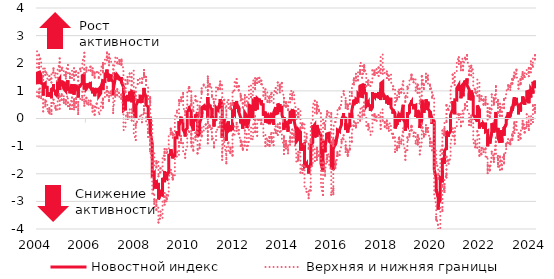
| Category | Новостной индекс | Верхняя и нижняя границы | Series 2 |
|---|---|---|---|
| 2004-02-02 | 1.694 | 0.954 | 2.433 |
| 2004-02-09 | 1.54 | 0.899 | 2.182 |
| 2004-02-16 | 1.43 | 0.903 | 1.956 |
| 2004-02-23 | 1.289 | 0.736 | 1.841 |
| 2004-03-01 | 1.298 | 0.813 | 1.782 |
| 2004-03-08 | 1.475 | 0.949 | 2.001 |
| 2004-03-15 | 1.307 | 0.767 | 1.847 |
| 2004-03-22 | 1.462 | 0.98 | 1.943 |
| 2004-03-29 | 1.723 | 1.14 | 2.305 |
| 2004-04-05 | 1.538 | 1.018 | 2.058 |
| 2004-04-12 | 1.479 | 0.944 | 2.013 |
| 2004-04-19 | 1.279 | 0.736 | 1.821 |
| 2004-04-26 | 1.297 | 0.775 | 1.82 |
| 2004-05-03 | 1.25 | 0.681 | 1.819 |
| 2004-05-10 | 1.098 | 0.445 | 1.751 |
| 2004-05-17 | 0.828 | 0.259 | 1.398 |
| 2004-05-24 | 0.883 | 0.303 | 1.462 |
| 2004-05-31 | 1.224 | 0.691 | 1.757 |
| 2004-06-07 | 1.279 | 0.73 | 1.828 |
| 2004-06-14 | 1.089 | 0.601 | 1.577 |
| 2004-06-21 | 1.069 | 0.443 | 1.696 |
| 2004-06-28 | 1.141 | 0.674 | 1.609 |
| 2004-07-05 | 1.131 | 0.575 | 1.686 |
| 2004-07-12 | 1.002 | 0.477 | 1.526 |
| 2004-07-19 | 0.882 | 0.32 | 1.445 |
| 2004-07-26 | 0.837 | 0.238 | 1.437 |
| 2004-08-02 | 0.838 | 0.313 | 1.363 |
| 2004-08-09 | 0.954 | 0.373 | 1.535 |
| 2004-08-16 | 0.803 | 0.216 | 1.391 |
| 2004-08-23 | 0.897 | 0.318 | 1.476 |
| 2004-08-30 | 0.832 | 0.177 | 1.488 |
| 2004-09-06 | 0.831 | 0.28 | 1.382 |
| 2004-09-13 | 0.732 | 0.16 | 1.304 |
| 2004-09-20 | 1.061 | 0.562 | 1.559 |
| 2004-09-27 | 1.093 | 0.502 | 1.684 |
| 2004-10-04 | 1.117 | 0.594 | 1.64 |
| 2004-10-11 | 1.248 | 0.682 | 1.814 |
| 2004-10-18 | 1.116 | 0.586 | 1.647 |
| 2004-10-25 | 1.056 | 0.551 | 1.561 |
| 2004-11-01 | 0.955 | 0.364 | 1.547 |
| 2004-11-08 | 1.014 | 0.395 | 1.632 |
| 2004-11-15 | 0.921 | 0.346 | 1.496 |
| 2004-11-22 | 0.978 | 0.45 | 1.505 |
| 2004-11-29 | 0.877 | 0.325 | 1.429 |
| 2004-12-06 | 0.804 | 0.259 | 1.349 |
| 2004-12-13 | 0.849 | 0.314 | 1.384 |
| 2004-12-20 | 1.007 | 0.419 | 1.595 |
| 2004-12-27 | 1.32 | 0.823 | 1.818 |
| 2005-01-03 | 1.439 | 0.905 | 1.972 |
| 2005-01-10 | 1.415 | 0.656 | 2.174 |
| 2005-01-17 | 1.034 | 0.354 | 1.714 |
| 2005-01-24 | 1.104 | 0.471 | 1.738 |
| 2005-01-31 | 1.356 | 0.814 | 1.898 |
| 2005-02-07 | 1.247 | 0.675 | 1.818 |
| 2005-02-14 | 1.219 | 0.685 | 1.753 |
| 2005-02-21 | 1.372 | 0.879 | 1.865 |
| 2005-02-28 | 1.33 | 0.81 | 1.849 |
| 2005-03-07 | 1.298 | 0.808 | 1.789 |
| 2005-03-14 | 1.133 | 0.588 | 1.679 |
| 2005-03-21 | 1.175 | 0.702 | 1.649 |
| 2005-03-28 | 1.082 | 0.562 | 1.602 |
| 2005-04-04 | 0.988 | 0.526 | 1.45 |
| 2005-04-11 | 1.153 | 0.639 | 1.667 |
| 2005-04-18 | 1.023 | 0.517 | 1.529 |
| 2005-04-25 | 1.237 | 0.74 | 1.734 |
| 2005-05-02 | 1.381 | 0.827 | 1.936 |
| 2005-05-09 | 1.049 | 0.447 | 1.651 |
| 2005-05-16 | 1.026 | 0.471 | 1.582 |
| 2005-05-23 | 1.066 | 0.575 | 1.558 |
| 2005-05-30 | 1.054 | 0.503 | 1.605 |
| 2005-06-06 | 1.033 | 0.418 | 1.649 |
| 2005-06-13 | 1.061 | 0.503 | 1.619 |
| 2005-06-20 | 0.91 | 0.35 | 1.469 |
| 2005-06-27 | 1.067 | 0.478 | 1.657 |
| 2005-07-04 | 1.243 | 0.758 | 1.729 |
| 2005-07-11 | 1.159 | 0.663 | 1.656 |
| 2005-07-18 | 0.908 | 0.349 | 1.467 |
| 2005-07-25 | 0.996 | 0.431 | 1.561 |
| 2005-08-01 | 1.174 | 0.7 | 1.649 |
| 2005-08-08 | 0.865 | 0.333 | 1.398 |
| 2005-08-15 | 1.163 | 0.626 | 1.7 |
| 2005-08-22 | 1.234 | 0.652 | 1.816 |
| 2005-08-29 | 1.173 | 0.539 | 1.807 |
| 2005-09-05 | 0.99 | 0.41 | 1.57 |
| 2005-09-12 | 1.085 | 0.568 | 1.601 |
| 2005-09-19 | 1.224 | 0.74 | 1.707 |
| 2005-09-26 | 1.102 | 0.558 | 1.645 |
| 2005-10-03 | 1.106 | 0.556 | 1.657 |
| 2005-10-10 | 1.018 | 0.417 | 1.619 |
| 2005-10-17 | 0.892 | 0.328 | 1.456 |
| 2005-10-24 | 0.763 | 0.16 | 1.366 |
| 2005-10-31 | 1.119 | 0.597 | 1.642 |
| 2005-11-07 | 1.184 | 0.662 | 1.705 |
| 2005-11-14 | 1.249 | 0.694 | 1.805 |
| 2005-11-21 | 1.241 | 0.722 | 1.759 |
| 2005-11-28 | 1.192 | 0.696 | 1.688 |
| 2005-12-05 | 1.283 | 0.787 | 1.779 |
| 2005-12-12 | 1.279 | 0.673 | 1.885 |
| 2005-12-19 | 1.431 | 0.943 | 1.919 |
| 2005-12-26 | 1.553 | 1.02 | 2.085 |
| 2006-01-02 | 1.593 | 0.985 | 2.202 |
| 2006-01-09 | 1.567 | 0.755 | 2.379 |
| 2006-01-16 | 1.437 | 0.75 | 2.123 |
| 2006-01-23 | 1.048 | 0.464 | 1.632 |
| 2006-01-30 | 1.254 | 0.685 | 1.823 |
| 2006-02-06 | 1.18 | 0.613 | 1.748 |
| 2006-02-13 | 1.271 | 0.702 | 1.839 |
| 2006-02-20 | 1.266 | 0.752 | 1.781 |
| 2006-02-27 | 1.08 | 0.499 | 1.661 |
| 2006-03-06 | 1.182 | 0.621 | 1.744 |
| 2006-03-13 | 1.143 | 0.507 | 1.779 |
| 2006-03-20 | 1.134 | 0.552 | 1.717 |
| 2006-03-27 | 1.233 | 0.662 | 1.804 |
| 2006-04-03 | 1.267 | 0.672 | 1.863 |
| 2006-04-10 | 1.134 | 0.524 | 1.744 |
| 2006-04-17 | 1.261 | 0.645 | 1.877 |
| 2006-04-24 | 1.11 | 0.508 | 1.713 |
| 2006-05-01 | 0.985 | 0.356 | 1.614 |
| 2006-05-08 | 0.91 | 0.25 | 1.569 |
| 2006-05-15 | 1.114 | 0.412 | 1.816 |
| 2006-05-22 | 1.039 | 0.461 | 1.616 |
| 2006-05-29 | 1.004 | 0.399 | 1.609 |
| 2006-06-05 | 1.055 | 0.434 | 1.675 |
| 2006-06-12 | 1.028 | 0.425 | 1.63 |
| 2006-06-19 | 0.809 | 0.138 | 1.481 |
| 2006-06-26 | 1.028 | 0.398 | 1.658 |
| 2006-07-03 | 1.047 | 0.454 | 1.639 |
| 2006-07-10 | 1.107 | 0.538 | 1.676 |
| 2006-07-17 | 1.077 | 0.464 | 1.69 |
| 2006-07-24 | 1.044 | 0.435 | 1.652 |
| 2006-07-31 | 0.988 | 0.369 | 1.607 |
| 2006-08-07 | 1.068 | 0.408 | 1.729 |
| 2006-08-14 | 0.851 | 0.232 | 1.469 |
| 2006-08-21 | 0.821 | 0.123 | 1.518 |
| 2006-08-28 | 0.808 | 0.127 | 1.489 |
| 2006-09-04 | 0.921 | 0.241 | 1.601 |
| 2006-09-11 | 1.073 | 0.416 | 1.729 |
| 2006-09-18 | 1.133 | 0.522 | 1.744 |
| 2006-09-25 | 1.161 | 0.51 | 1.812 |
| 2006-10-02 | 1.364 | 0.719 | 2.009 |
| 2006-10-09 | 1.03 | 0.389 | 1.67 |
| 2006-10-16 | 1.312 | 0.691 | 1.933 |
| 2006-10-23 | 1.194 | 0.56 | 1.829 |
| 2006-10-30 | 1.37 | 0.734 | 2.006 |
| 2006-11-06 | 1.347 | 0.737 | 1.957 |
| 2006-11-13 | 1.403 | 0.791 | 2.015 |
| 2006-11-20 | 1.453 | 0.883 | 2.024 |
| 2006-11-27 | 1.61 | 1.007 | 2.213 |
| 2006-12-04 | 1.594 | 0.969 | 2.219 |
| 2006-12-11 | 1.77 | 1.149 | 2.391 |
| 2006-12-18 | 1.471 | 0.834 | 2.109 |
| 2006-12-25 | 1.626 | 1.034 | 2.217 |
| 2007-01-01 | 1.543 | 0.945 | 2.142 |
| 2007-01-08 | 1.518 | 0.713 | 2.322 |
| 2007-01-15 | 1.423 | 0.632 | 2.214 |
| 2007-01-22 | 1.338 | 0.749 | 1.928 |
| 2007-01-29 | 1.578 | 0.978 | 2.178 |
| 2007-02-05 | 1.536 | 0.906 | 2.165 |
| 2007-02-12 | 1.588 | 0.981 | 2.195 |
| 2007-02-19 | 1.584 | 0.975 | 2.194 |
| 2007-02-26 | 1.415 | 0.786 | 2.044 |
| 2007-03-05 | 1.324 | 0.731 | 1.917 |
| 2007-03-12 | 0.992 | 0.353 | 1.631 |
| 2007-03-19 | 0.842 | 0.203 | 1.482 |
| 2007-03-26 | 1.01 | 0.341 | 1.679 |
| 2007-04-02 | 1.449 | 0.787 | 2.112 |
| 2007-04-09 | 1.466 | 0.831 | 2.102 |
| 2007-04-16 | 1.481 | 0.875 | 2.088 |
| 2007-04-23 | 1.462 | 0.824 | 2.1 |
| 2007-04-30 | 1.595 | 0.993 | 2.196 |
| 2007-05-07 | 1.543 | 0.837 | 2.248 |
| 2007-05-14 | 1.413 | 0.83 | 1.997 |
| 2007-05-21 | 1.462 | 0.854 | 2.07 |
| 2007-05-28 | 1.568 | 1.059 | 2.077 |
| 2007-06-04 | 1.476 | 0.898 | 2.055 |
| 2007-06-11 | 1.417 | 0.854 | 1.98 |
| 2007-06-18 | 1.445 | 0.772 | 2.118 |
| 2007-06-25 | 1.382 | 0.772 | 1.992 |
| 2007-07-02 | 1.385 | 0.762 | 2.008 |
| 2007-07-09 | 1.467 | 0.866 | 2.068 |
| 2007-07-16 | 1.342 | 0.743 | 1.941 |
| 2007-07-23 | 1.496 | 0.859 | 2.133 |
| 2007-07-30 | 1.309 | 0.658 | 1.96 |
| 2007-08-06 | 1.146 | 0.475 | 1.816 |
| 2007-08-13 | 0.822 | 0.163 | 1.481 |
| 2007-08-20 | 0.463 | -0.251 | 1.177 |
| 2007-08-27 | 0.296 | -0.426 | 1.017 |
| 2007-09-03 | 0.363 | -0.349 | 1.076 |
| 2007-09-10 | 0.351 | -0.334 | 1.036 |
| 2007-09-17 | 0.299 | -0.351 | 0.949 |
| 2007-09-24 | 0.753 | 0.116 | 1.389 |
| 2007-10-01 | 0.691 | 0.019 | 1.362 |
| 2007-10-08 | 0.629 | -0.003 | 1.261 |
| 2007-10-15 | 0.65 | -0.021 | 1.322 |
| 2007-10-22 | 0.854 | 0.206 | 1.502 |
| 2007-10-29 | 0.684 | 0.038 | 1.33 |
| 2007-11-05 | 0.67 | 0.016 | 1.323 |
| 2007-11-12 | 0.661 | 0.007 | 1.315 |
| 2007-11-19 | 0.804 | 0.144 | 1.464 |
| 2007-11-26 | 0.982 | 0.338 | 1.626 |
| 2007-12-03 | 0.849 | 0.219 | 1.479 |
| 2007-12-10 | 0.586 | -0.072 | 1.243 |
| 2007-12-17 | 0.55 | -0.104 | 1.205 |
| 2007-12-24 | 0.707 | 0.016 | 1.398 |
| 2007-12-31 | 0.99 | 0.327 | 1.653 |
| 2008-01-07 | 0.949 | 0.153 | 1.746 |
| 2008-01-14 | 0.632 | -0.256 | 1.521 |
| 2008-01-21 | 0.547 | -0.25 | 1.344 |
| 2008-01-28 | 0.234 | -0.54 | 1.007 |
| 2008-02-04 | -0.017 | -0.776 | 0.742 |
| 2008-02-11 | -0.016 | -0.709 | 0.677 |
| 2008-02-18 | 0.443 | -0.191 | 1.077 |
| 2008-02-25 | 0.433 | -0.259 | 1.125 |
| 2008-03-03 | 0.625 | -0.014 | 1.265 |
| 2008-03-10 | 0.668 | -0.001 | 1.337 |
| 2008-03-17 | 0.706 | 0.015 | 1.397 |
| 2008-03-24 | 0.636 | -0.025 | 1.297 |
| 2008-03-31 | 0.607 | -0.014 | 1.228 |
| 2008-04-07 | 0.61 | -0.029 | 1.248 |
| 2008-04-14 | 0.64 | -0.011 | 1.29 |
| 2008-04-21 | 0.813 | 0.159 | 1.468 |
| 2008-04-28 | 0.841 | 0.185 | 1.497 |
| 2008-05-05 | 0.803 | 0.106 | 1.5 |
| 2008-05-12 | 0.639 | -0.061 | 1.338 |
| 2008-05-19 | 0.574 | -0.136 | 1.284 |
| 2008-05-26 | 0.646 | -0.078 | 1.371 |
| 2008-06-02 | 0.928 | 0.29 | 1.566 |
| 2008-06-09 | 0.844 | 0.194 | 1.494 |
| 2008-06-16 | 1.107 | 0.455 | 1.759 |
| 2008-06-23 | 0.959 | 0.325 | 1.592 |
| 2008-06-30 | 0.96 | 0.267 | 1.653 |
| 2008-07-07 | 0.792 | 0.184 | 1.401 |
| 2008-07-14 | 0.849 | 0.191 | 1.506 |
| 2008-07-21 | 0.532 | -0.149 | 1.213 |
| 2008-07-28 | 0.487 | -0.18 | 1.153 |
| 2008-08-04 | 0.425 | -0.262 | 1.112 |
| 2008-08-11 | 0.228 | -0.482 | 0.938 |
| 2008-08-18 | 0.228 | -0.376 | 0.833 |
| 2008-08-25 | 0.001 | -0.695 | 0.698 |
| 2008-09-01 | 0.006 | -0.715 | 0.727 |
| 2008-09-08 | -0.191 | -0.952 | 0.569 |
| 2008-09-15 | 0.055 | -0.664 | 0.774 |
| 2008-09-22 | -0.481 | -1.191 | 0.229 |
| 2008-09-29 | -0.467 | -1.122 | 0.188 |
| 2008-10-06 | -0.915 | -1.624 | -0.206 |
| 2008-10-13 | -1.423 | -2.164 | -0.682 |
| 2008-10-20 | -1.666 | -2.4 | -0.933 |
| 2008-10-27 | -2.042 | -2.789 | -1.295 |
| 2008-11-03 | -1.962 | -2.68 | -1.244 |
| 2008-11-10 | -2.226 | -3.016 | -1.436 |
| 2008-11-17 | -2.208 | -2.946 | -1.47 |
| 2008-11-24 | -2.463 | -3.219 | -1.707 |
| 2008-12-01 | -2.348 | -3.105 | -1.591 |
| 2008-12-08 | -2.542 | -3.312 | -1.772 |
| 2008-12-15 | -2.248 | -2.959 | -1.537 |
| 2008-12-22 | -2.304 | -3.038 | -1.569 |
| 2008-12-29 | -2.39 | -3.135 | -1.646 |
| 2009-01-05 | -2.383 | -3.236 | -1.529 |
| 2009-01-12 | -2.517 | -3.459 | -1.575 |
| 2009-01-19 | -2.826 | -3.715 | -1.937 |
| 2009-01-26 | -2.928 | -3.764 | -2.092 |
| 2009-02-02 | -2.732 | -3.565 | -1.899 |
| 2009-02-09 | -2.704 | -3.496 | -1.911 |
| 2009-02-16 | -2.583 | -3.369 | -1.798 |
| 2009-02-23 | -2.743 | -3.544 | -1.942 |
| 2009-03-02 | -2.78 | -3.61 | -1.951 |
| 2009-03-09 | -2.705 | -3.51 | -1.9 |
| 2009-03-16 | -2.363 | -3.139 | -1.587 |
| 2009-03-23 | -2.192 | -2.988 | -1.395 |
| 2009-03-30 | -2.16 | -2.977 | -1.342 |
| 2009-04-06 | -2.163 | -2.981 | -1.346 |
| 2009-04-13 | -2.305 | -3.117 | -1.494 |
| 2009-04-20 | -1.903 | -2.7 | -1.105 |
| 2009-04-27 | -2.117 | -2.952 | -1.282 |
| 2009-05-04 | -2.172 | -3.054 | -1.29 |
| 2009-05-11 | -2.144 | -2.997 | -1.291 |
| 2009-05-18 | -1.942 | -2.762 | -1.122 |
| 2009-05-25 | -2.078 | -2.922 | -1.234 |
| 2009-06-01 | -1.936 | -2.732 | -1.141 |
| 2009-06-08 | -1.719 | -2.519 | -0.918 |
| 2009-06-15 | -1.677 | -2.519 | -0.835 |
| 2009-06-22 | -1.326 | -2.082 | -0.569 |
| 2009-06-29 | -1.354 | -2.115 | -0.593 |
| 2009-07-06 | -1.302 | -2.029 | -0.575 |
| 2009-07-13 | -1.25 | -1.993 | -0.506 |
| 2009-07-20 | -1.296 | -2.024 | -0.567 |
| 2009-07-27 | -1.112 | -1.857 | -0.367 |
| 2009-08-03 | -1.404 | -2.208 | -0.6 |
| 2009-08-10 | -1.301 | -2.055 | -0.547 |
| 2009-08-17 | -1.443 | -2.194 | -0.692 |
| 2009-08-24 | -1.472 | -2.229 | -0.714 |
| 2009-08-31 | -1.332 | -2.059 | -0.606 |
| 2009-09-07 | -1.347 | -2.116 | -0.577 |
| 2009-09-14 | -0.881 | -1.645 | -0.117 |
| 2009-09-21 | -0.699 | -1.454 | 0.057 |
| 2009-09-28 | -0.669 | -1.451 | 0.113 |
| 2009-10-05 | -0.701 | -1.422 | 0.02 |
| 2009-10-12 | -0.597 | -1.316 | 0.121 |
| 2009-10-19 | -0.459 | -1.2 | 0.282 |
| 2009-10-26 | -0.51 | -1.25 | 0.231 |
| 2009-11-02 | -0.567 | -1.317 | 0.183 |
| 2009-11-09 | -0.418 | -1.173 | 0.337 |
| 2009-11-16 | -0.096 | -0.856 | 0.665 |
| 2009-11-23 | -0.137 | -0.895 | 0.62 |
| 2009-11-30 | -0.229 | -0.994 | 0.536 |
| 2009-12-07 | -0.114 | -0.865 | 0.637 |
| 2009-12-14 | 0.065 | -0.634 | 0.764 |
| 2009-12-21 | -0.13 | -0.883 | 0.624 |
| 2009-12-28 | -0.013 | -0.765 | 0.739 |
| 2010-01-04 | -0.066 | -0.903 | 0.77 |
| 2010-01-11 | -0.065 | -1.054 | 0.924 |
| 2010-01-18 | -0.259 | -1.12 | 0.602 |
| 2010-01-25 | -0.399 | -1.229 | 0.431 |
| 2010-02-01 | -0.552 | -1.315 | 0.212 |
| 2010-02-08 | -0.649 | -1.421 | 0.122 |
| 2010-02-15 | -0.428 | -1.213 | 0.357 |
| 2010-02-22 | -0.397 | -1.169 | 0.375 |
| 2010-03-01 | -0.351 | -1.092 | 0.389 |
| 2010-03-08 | -0.209 | -0.921 | 0.502 |
| 2010-03-15 | 0.084 | -0.616 | 0.784 |
| 2010-03-22 | 0.242 | -0.491 | 0.975 |
| 2010-03-29 | 0.257 | -0.465 | 0.979 |
| 2010-04-05 | 0.36 | -0.424 | 1.145 |
| 2010-04-12 | 0.252 | -0.49 | 0.993 |
| 2010-04-19 | 0.343 | -0.42 | 1.105 |
| 2010-04-26 | 0.363 | -0.393 | 1.118 |
| 2010-05-03 | 0.256 | -0.456 | 0.968 |
| 2010-05-10 | -0.256 | -1.014 | 0.503 |
| 2010-05-17 | 0.029 | -0.702 | 0.759 |
| 2010-05-24 | 0.088 | -0.547 | 0.723 |
| 2010-05-31 | -0.191 | -0.874 | 0.492 |
| 2010-06-07 | -0.446 | -1.161 | 0.269 |
| 2010-06-14 | -0.423 | -1.087 | 0.241 |
| 2010-06-21 | -0.312 | -1.034 | 0.41 |
| 2010-06-28 | -0.066 | -0.716 | 0.585 |
| 2010-07-05 | -0.056 | -0.735 | 0.623 |
| 2010-07-12 | 0.143 | -0.519 | 0.806 |
| 2010-07-19 | -0.097 | -0.768 | 0.574 |
| 2010-07-26 | -0.077 | -0.741 | 0.586 |
| 2010-08-02 | 0.231 | -0.227 | 0.69 |
| 2010-08-09 | 0.061 | -0.534 | 0.657 |
| 2010-08-16 | -0.301 | -1.001 | 0.399 |
| 2010-08-23 | -0.529 | -1.267 | 0.209 |
| 2010-08-30 | -0.656 | -1.132 | -0.181 |
| 2010-09-06 | -0.515 | -1.149 | 0.119 |
| 2010-09-13 | -0.296 | -0.976 | 0.383 |
| 2010-09-20 | -0.455 | -1.076 | 0.166 |
| 2010-09-27 | -0.178 | -0.878 | 0.523 |
| 2010-10-04 | 0.063 | -0.677 | 0.804 |
| 2010-10-11 | 0.254 | -0.474 | 0.983 |
| 2010-10-18 | 0.159 | -0.625 | 0.943 |
| 2010-10-25 | 0.388 | -0.338 | 1.114 |
| 2010-11-01 | 0.447 | -0.255 | 1.149 |
| 2010-11-08 | 0.473 | -0.281 | 1.226 |
| 2010-11-15 | 0.42 | -0.347 | 1.188 |
| 2010-11-22 | 0.359 | -0.437 | 1.156 |
| 2010-11-29 | 0.378 | -0.467 | 1.223 |
| 2010-12-06 | 0.34 | -0.44 | 1.119 |
| 2010-12-13 | 0.35 | -0.458 | 1.158 |
| 2010-12-20 | 0.437 | -0.286 | 1.161 |
| 2010-12-27 | 0.456 | -0.217 | 1.129 |
| 2011-01-03 | 0.394 | -0.37 | 1.158 |
| 2011-01-10 | 0.387 | -0.543 | 1.318 |
| 2011-01-17 | -0.019 | -0.899 | 0.861 |
| 2011-01-24 | 0.775 | 0.031 | 1.518 |
| 2011-01-31 | 0.598 | -0.165 | 1.361 |
| 2011-02-07 | 0.426 | -0.309 | 1.162 |
| 2011-02-14 | 0.495 | -0.256 | 1.246 |
| 2011-02-21 | 0.431 | -0.333 | 1.194 |
| 2011-02-28 | 0.41 | -0.357 | 1.177 |
| 2011-03-07 | 0.324 | -0.439 | 1.087 |
| 2011-03-14 | 0.375 | -0.355 | 1.104 |
| 2011-03-21 | 0.016 | -0.754 | 0.787 |
| 2011-03-28 | 0.083 | -0.67 | 0.837 |
| 2011-04-04 | -0.059 | -0.781 | 0.663 |
| 2011-04-11 | -0.087 | -0.845 | 0.671 |
| 2011-04-18 | -0.292 | -1.045 | 0.462 |
| 2011-04-25 | -0.091 | -0.873 | 0.692 |
| 2011-05-02 | -0.039 | -0.778 | 0.7 |
| 2011-05-09 | -0.054 | -0.794 | 0.687 |
| 2011-05-16 | 0.207 | -0.545 | 0.958 |
| 2011-05-23 | 0.341 | -0.387 | 1.069 |
| 2011-05-30 | 0.396 | -0.357 | 1.15 |
| 2011-06-06 | 0.31 | -0.42 | 1.04 |
| 2011-06-13 | 0.388 | -0.335 | 1.112 |
| 2011-06-20 | 0.399 | -0.332 | 1.129 |
| 2011-06-27 | 0.347 | -0.369 | 1.064 |
| 2011-07-04 | 0.556 | -0.129 | 1.242 |
| 2011-07-11 | 0.529 | -0.142 | 1.199 |
| 2011-07-18 | 0.373 | -0.316 | 1.062 |
| 2011-07-25 | 0.698 | 0.057 | 1.338 |
| 2011-08-01 | 0.52 | -0.142 | 1.181 |
| 2011-08-08 | 0.086 | -0.629 | 0.802 |
| 2011-08-15 | -0.492 | -1.269 | 0.286 |
| 2011-08-22 | -0.705 | -1.494 | 0.084 |
| 2011-08-29 | -0.398 | -1.157 | 0.361 |
| 2011-09-05 | -0.013 | -0.703 | 0.677 |
| 2011-09-12 | -0.075 | -0.764 | 0.614 |
| 2011-09-19 | -0.177 | -0.932 | 0.577 |
| 2011-09-26 | -0.183 | -0.97 | 0.605 |
| 2011-10-03 | -0.514 | -1.324 | 0.296 |
| 2011-10-10 | -0.639 | -1.41 | 0.131 |
| 2011-10-17 | -0.805 | -1.621 | 0.011 |
| 2011-10-24 | -0.699 | -1.497 | 0.1 |
| 2011-10-31 | -0.266 | -1.053 | 0.521 |
| 2011-11-07 | -0.103 | -0.873 | 0.667 |
| 2011-11-14 | -0.128 | -0.865 | 0.609 |
| 2011-11-21 | -0.242 | -0.975 | 0.49 |
| 2011-11-28 | -0.448 | -1.242 | 0.346 |
| 2011-12-05 | -0.36 | -1.166 | 0.446 |
| 2011-12-12 | -0.257 | -1.057 | 0.542 |
| 2011-12-19 | -0.459 | -1.255 | 0.337 |
| 2011-12-26 | -0.346 | -1.118 | 0.426 |
| 2012-01-02 | -0.224 | -1.004 | 0.556 |
| 2012-01-09 | -0.422 | -1.343 | 0.5 |
| 2012-01-16 | -0.317 | -1.182 | 0.549 |
| 2012-01-23 | -0.021 | -0.837 | 0.795 |
| 2012-01-30 | 0.256 | -0.52 | 1.033 |
| 2012-02-06 | 0.152 | -0.639 | 0.944 |
| 2012-02-13 | 0.307 | -0.453 | 1.068 |
| 2012-02-20 | 0.38 | -0.392 | 1.151 |
| 2012-02-27 | 0.541 | -0.292 | 1.375 |
| 2012-03-05 | 0.542 | -0.192 | 1.276 |
| 2012-03-12 | 0.346 | -0.446 | 1.138 |
| 2012-03-19 | 0.636 | -0.157 | 1.428 |
| 2012-03-26 | 0.537 | -0.201 | 1.275 |
| 2012-04-02 | 0.409 | -0.356 | 1.174 |
| 2012-04-09 | 0.233 | -0.552 | 1.017 |
| 2012-04-16 | 0.242 | -0.557 | 1.041 |
| 2012-04-23 | 0.381 | -0.41 | 1.173 |
| 2012-04-30 | 0.252 | -0.537 | 1.04 |
| 2012-05-07 | 0.023 | -0.826 | 0.872 |
| 2012-05-14 | 0.047 | -0.79 | 0.885 |
| 2012-05-21 | -0.172 | -1 | 0.656 |
| 2012-05-28 | 0.02 | -0.798 | 0.839 |
| 2012-06-04 | -0.267 | -1.087 | 0.553 |
| 2012-06-11 | -0.367 | -1.131 | 0.398 |
| 2012-06-18 | -0.198 | -1.015 | 0.618 |
| 2012-06-25 | -0.079 | -0.852 | 0.694 |
| 2012-07-02 | -0.016 | -0.788 | 0.756 |
| 2012-07-09 | -0.251 | -0.981 | 0.478 |
| 2012-07-16 | -0.084 | -0.743 | 0.574 |
| 2012-07-23 | 0.206 | -0.434 | 0.846 |
| 2012-07-30 | 0.17 | -0.436 | 0.777 |
| 2012-08-06 | 0.09 | -0.594 | 0.774 |
| 2012-08-13 | -0.229 | -0.989 | 0.531 |
| 2012-08-20 | -0.277 | -1.062 | 0.508 |
| 2012-08-27 | -0.347 | -1.133 | 0.439 |
| 2012-09-03 | -0.045 | -0.794 | 0.704 |
| 2012-09-10 | 0.135 | -0.568 | 0.838 |
| 2012-09-17 | 0.411 | -0.287 | 1.109 |
| 2012-09-24 | 0.486 | -0.247 | 1.22 |
| 2012-10-01 | 0.445 | -0.302 | 1.191 |
| 2012-10-08 | 0.295 | -0.449 | 1.039 |
| 2012-10-15 | 0.025 | -0.733 | 0.783 |
| 2012-10-22 | 0.07 | -0.725 | 0.865 |
| 2012-10-29 | 0.107 | -0.677 | 0.89 |
| 2012-11-05 | 0.037 | -0.769 | 0.843 |
| 2012-11-12 | 0.064 | -0.748 | 0.876 |
| 2012-11-19 | 0.245 | -0.514 | 1.004 |
| 2012-11-26 | 0.626 | -0.14 | 1.392 |
| 2012-12-03 | 0.547 | -0.193 | 1.286 |
| 2012-12-10 | 0.285 | -0.494 | 1.063 |
| 2012-12-17 | 0.532 | -0.176 | 1.24 |
| 2012-12-24 | 0.767 | 0.08 | 1.454 |
| 2012-12-31 | 0.558 | -0.164 | 1.28 |
| 2013-01-07 | 0.549 | -0.349 | 1.446 |
| 2013-01-14 | 0.327 | -0.626 | 1.28 |
| 2013-01-21 | 0.519 | -0.332 | 1.369 |
| 2013-01-28 | 0.726 | 0.015 | 1.438 |
| 2013-02-04 | 0.651 | -0.093 | 1.394 |
| 2013-02-11 | 0.597 | -0.124 | 1.318 |
| 2013-02-18 | 0.717 | -0.04 | 1.474 |
| 2013-02-25 | 0.645 | -0.098 | 1.388 |
| 2013-03-04 | 0.611 | -0.144 | 1.367 |
| 2013-03-11 | 0.519 | -0.204 | 1.242 |
| 2013-03-18 | 0.659 | -0.052 | 1.37 |
| 2013-03-25 | 0.52 | -0.221 | 1.262 |
| 2013-04-01 | 0.503 | -0.177 | 1.182 |
| 2013-04-08 | 0.277 | -0.382 | 0.937 |
| 2013-04-15 | 0.221 | -0.514 | 0.955 |
| 2013-04-22 | 0.223 | -0.523 | 0.969 |
| 2013-04-29 | 0.095 | -0.641 | 0.831 |
| 2013-05-06 | 0.249 | -0.557 | 1.056 |
| 2013-05-13 | 0.136 | -0.702 | 0.973 |
| 2013-05-20 | -0.15 | -1.002 | 0.703 |
| 2013-05-27 | 0.07 | -0.782 | 0.922 |
| 2013-06-03 | 0.125 | -0.689 | 0.94 |
| 2013-06-10 | 0.029 | -0.677 | 0.736 |
| 2013-06-17 | -0.175 | -0.952 | 0.602 |
| 2013-06-24 | -0.178 | -0.956 | 0.599 |
| 2013-07-01 | 0.066 | -0.666 | 0.797 |
| 2013-07-08 | -0.204 | -0.998 | 0.59 |
| 2013-07-15 | -0.176 | -0.95 | 0.597 |
| 2013-07-22 | 0.035 | -0.678 | 0.748 |
| 2013-07-29 | 0.055 | -0.667 | 0.778 |
| 2013-08-05 | 0.205 | -0.52 | 0.93 |
| 2013-08-12 | -0.033 | -0.774 | 0.709 |
| 2013-08-19 | -0.117 | -0.868 | 0.635 |
| 2013-08-26 | -0.027 | -0.712 | 0.658 |
| 2013-09-02 | -0.18 | -0.901 | 0.541 |
| 2013-09-09 | -0.23 | -0.967 | 0.507 |
| 2013-09-16 | -0.231 | -0.98 | 0.519 |
| 2013-09-23 | -0.178 | -0.928 | 0.572 |
| 2013-09-30 | 0.215 | -0.482 | 0.912 |
| 2013-10-07 | 0.41 | -0.285 | 1.105 |
| 2013-10-14 | 0.209 | -0.519 | 0.936 |
| 2013-10-21 | 0.252 | -0.444 | 0.947 |
| 2013-10-28 | 0.166 | -0.544 | 0.876 |
| 2013-11-04 | 0.194 | -0.539 | 0.927 |
| 2013-11-11 | 0.196 | -0.597 | 0.989 |
| 2013-11-18 | 0.43 | -0.297 | 1.158 |
| 2013-11-25 | 0.544 | -0.217 | 1.305 |
| 2013-12-02 | 0.4 | -0.359 | 1.158 |
| 2013-12-09 | 0.292 | -0.42 | 1.004 |
| 2013-12-16 | 0.232 | -0.484 | 0.947 |
| 2013-12-23 | 0.523 | -0.175 | 1.222 |
| 2013-12-30 | 0.369 | -0.405 | 1.144 |
| 2014-01-06 | 0.398 | -0.496 | 1.292 |
| 2014-01-13 | 0.233 | -0.732 | 1.199 |
| 2014-01-20 | 0.145 | -0.754 | 1.043 |
| 2014-01-27 | 0.155 | -0.722 | 1.032 |
| 2014-02-03 | -0.11 | -1.012 | 0.793 |
| 2014-02-10 | -0.408 | -1.283 | 0.466 |
| 2014-02-17 | 0.053 | -0.642 | 0.747 |
| 2014-02-24 | -0.295 | -1.056 | 0.467 |
| 2014-03-03 | -0.199 | -0.964 | 0.567 |
| 2014-03-10 | -0.332 | -1.087 | 0.423 |
| 2014-03-17 | -0.11 | -0.814 | 0.593 |
| 2014-03-24 | -0.266 | -0.976 | 0.445 |
| 2014-03-31 | -0.186 | -0.896 | 0.525 |
| 2014-04-07 | -0.313 | -1.058 | 0.432 |
| 2014-04-14 | -0.48 | -1.26 | 0.3 |
| 2014-04-21 | -0.287 | -1.041 | 0.468 |
| 2014-04-28 | -0.206 | -0.979 | 0.567 |
| 2014-05-05 | 0.013 | -0.702 | 0.728 |
| 2014-05-12 | -0.18 | -0.945 | 0.585 |
| 2014-05-19 | -0.004 | -0.766 | 0.759 |
| 2014-05-26 | 0.225 | -0.523 | 0.974 |
| 2014-06-02 | 0.268 | -0.475 | 1.011 |
| 2014-06-09 | 0.175 | -0.58 | 0.929 |
| 2014-06-16 | 0.073 | -0.741 | 0.887 |
| 2014-06-23 | -0.071 | -0.837 | 0.696 |
| 2014-06-30 | 0.289 | -0.366 | 0.943 |
| 2014-07-07 | 0.265 | -0.428 | 0.958 |
| 2014-07-14 | 0.108 | -0.618 | 0.835 |
| 2014-07-21 | 0.151 | -0.545 | 0.846 |
| 2014-07-28 | -0.105 | -0.833 | 0.622 |
| 2014-08-04 | -0.459 | -1.198 | 0.279 |
| 2014-08-11 | -0.651 | -1.374 | 0.072 |
| 2014-08-18 | -0.841 | -1.61 | -0.071 |
| 2014-08-25 | -0.834 | -1.615 | -0.052 |
| 2014-09-01 | -0.738 | -1.515 | 0.04 |
| 2014-09-08 | -0.552 | -1.308 | 0.204 |
| 2014-09-15 | -0.724 | -1.497 | 0.048 |
| 2014-09-22 | -0.711 | -1.467 | 0.046 |
| 2014-09-29 | -0.4 | -1.16 | 0.36 |
| 2014-10-06 | -0.485 | -1.257 | 0.287 |
| 2014-10-13 | -0.705 | -1.501 | 0.091 |
| 2014-10-20 | -0.962 | -1.749 | -0.175 |
| 2014-10-27 | -1.161 | -1.956 | -0.367 |
| 2014-11-03 | -0.943 | -1.712 | -0.175 |
| 2014-11-10 | -1.158 | -1.971 | -0.345 |
| 2014-11-17 | -0.997 | -1.73 | -0.264 |
| 2014-11-24 | -0.949 | -1.686 | -0.212 |
| 2014-12-01 | -0.906 | -1.658 | -0.153 |
| 2014-12-08 | -0.987 | -1.743 | -0.231 |
| 2014-12-15 | -1.188 | -1.974 | -0.402 |
| 2014-12-22 | -1.532 | -2.327 | -0.737 |
| 2014-12-29 | -1.736 | -2.543 | -0.929 |
| 2015-01-05 | -1.633 | -2.543 | -0.723 |
| 2015-01-12 | -1.606 | -2.655 | -0.556 |
| 2015-01-19 | -1.73 | -2.651 | -0.808 |
| 2015-01-26 | -1.728 | -2.601 | -0.855 |
| 2015-02-02 | -1.741 | -2.634 | -0.848 |
| 2015-02-09 | -1.988 | -2.885 | -1.091 |
| 2015-02-16 | -1.994 | -2.865 | -1.123 |
| 2015-02-23 | -1.835 | -2.705 | -0.966 |
| 2015-03-02 | -1.633 | -2.474 | -0.792 |
| 2015-03-09 | -1.749 | -2.607 | -0.891 |
| 2015-03-16 | -1.615 | -2.474 | -0.756 |
| 2015-03-23 | -1.336 | -2.181 | -0.49 |
| 2015-03-30 | -0.987 | -1.784 | -0.191 |
| 2015-04-06 | -0.872 | -1.643 | -0.1 |
| 2015-04-13 | -0.251 | -0.988 | 0.485 |
| 2015-04-20 | -0.24 | -0.987 | 0.508 |
| 2015-04-27 | -0.32 | -1.144 | 0.504 |
| 2015-05-04 | -0.218 | -1.079 | 0.642 |
| 2015-05-11 | -0.507 | -1.399 | 0.385 |
| 2015-05-18 | -0.642 | -1.54 | 0.256 |
| 2015-05-25 | -0.685 | -1.544 | 0.174 |
| 2015-06-01 | -0.525 | -1.342 | 0.292 |
| 2015-06-08 | -0.516 | -1.349 | 0.317 |
| 2015-06-15 | -0.324 | -1.131 | 0.483 |
| 2015-06-22 | -0.658 | -1.501 | 0.185 |
| 2015-06-29 | -0.236 | -1.055 | 0.582 |
| 2015-07-06 | -0.511 | -1.344 | 0.321 |
| 2015-07-13 | -0.557 | -1.376 | 0.261 |
| 2015-07-20 | -0.487 | -1.265 | 0.291 |
| 2015-07-27 | -0.463 | -1.243 | 0.316 |
| 2015-08-03 | -0.604 | -1.386 | 0.177 |
| 2015-08-10 | -1.029 | -1.834 | -0.224 |
| 2015-08-17 | -1.19 | -1.99 | -0.39 |
| 2015-08-24 | -1.474 | -2.305 | -0.643 |
| 2015-08-31 | -1.633 | -2.455 | -0.81 |
| 2015-09-07 | -1.919 | -2.775 | -1.063 |
| 2015-09-14 | -1.525 | -2.355 | -0.694 |
| 2015-09-21 | -1.182 | -1.991 | -0.373 |
| 2015-09-28 | -0.811 | -1.596 | -0.027 |
| 2015-10-05 | -1.089 | -1.915 | -0.263 |
| 2015-10-12 | -1.133 | -1.951 | -0.315 |
| 2015-10-19 | -1.226 | -2.068 | -0.383 |
| 2015-10-26 | -1.041 | -1.879 | -0.204 |
| 2015-11-02 | -0.555 | -1.33 | 0.22 |
| 2015-11-09 | -0.611 | -1.417 | 0.195 |
| 2015-11-16 | -0.531 | -1.327 | 0.265 |
| 2015-11-23 | -0.717 | -1.568 | 0.134 |
| 2015-11-30 | -0.554 | -1.328 | 0.22 |
| 2015-12-07 | -0.531 | -1.276 | 0.214 |
| 2015-12-14 | -0.688 | -1.438 | 0.062 |
| 2015-12-21 | -0.828 | -1.638 | -0.019 |
| 2015-12-28 | -0.862 | -1.701 | -0.023 |
| 2016-01-04 | -0.888 | -1.819 | 0.043 |
| 2016-01-11 | -0.873 | -1.94 | 0.194 |
| 2016-01-18 | -1.494 | -2.47 | -0.518 |
| 2016-01-25 | -1.834 | -2.758 | -0.911 |
| 2016-02-01 | -1.636 | -2.527 | -0.746 |
| 2016-02-08 | -1.766 | -2.638 | -0.893 |
| 2016-02-15 | -1.864 | -2.741 | -0.986 |
| 2016-02-22 | -1.65 | -2.498 | -0.802 |
| 2016-02-29 | -1.096 | -1.888 | -0.305 |
| 2016-03-07 | -0.914 | -1.687 | -0.141 |
| 2016-03-14 | -0.77 | -1.557 | 0.016 |
| 2016-03-21 | -0.883 | -1.709 | -0.057 |
| 2016-03-28 | -0.959 | -1.792 | -0.127 |
| 2016-04-04 | -0.58 | -1.282 | 0.122 |
| 2016-04-11 | -0.51 | -1.252 | 0.232 |
| 2016-04-18 | -0.582 | -1.362 | 0.198 |
| 2016-04-25 | -0.418 | -1.205 | 0.369 |
| 2016-05-02 | -0.469 | -1.282 | 0.344 |
| 2016-05-09 | -0.463 | -1.326 | 0.4 |
| 2016-05-16 | -0.473 | -1.299 | 0.354 |
| 2016-05-23 | -0.471 | -1.291 | 0.349 |
| 2016-05-30 | -0.429 | -1.23 | 0.372 |
| 2016-06-06 | -0.217 | -0.981 | 0.548 |
| 2016-06-13 | -0.036 | -0.769 | 0.697 |
| 2016-06-20 | -0.054 | -0.846 | 0.738 |
| 2016-06-27 | -0.001 | -0.798 | 0.796 |
| 2016-07-04 | 0.128 | -0.648 | 0.904 |
| 2016-07-11 | 0.191 | -0.608 | 0.989 |
| 2016-07-18 | 0.157 | -0.668 | 0.982 |
| 2016-07-25 | 0.047 | -0.769 | 0.864 |
| 2016-08-01 | 0.017 | -0.784 | 0.819 |
| 2016-08-08 | -0.252 | -1.038 | 0.534 |
| 2016-08-15 | -0.272 | -1.062 | 0.518 |
| 2016-08-22 | -0.419 | -1.215 | 0.376 |
| 2016-08-29 | -0.166 | -0.978 | 0.645 |
| 2016-09-05 | -0.4 | -1.228 | 0.427 |
| 2016-09-12 | -0.329 | -1.157 | 0.5 |
| 2016-09-19 | -0.504 | -1.352 | 0.345 |
| 2016-09-26 | -0.413 | -1.295 | 0.469 |
| 2016-10-03 | -0.254 | -1.088 | 0.58 |
| 2016-10-10 | -0.301 | -1.127 | 0.525 |
| 2016-10-17 | -0.153 | -0.992 | 0.687 |
| 2016-10-24 | -0.122 | -0.98 | 0.736 |
| 2016-10-31 | 0.157 | -0.659 | 0.974 |
| 2016-11-07 | 0.156 | -0.649 | 0.96 |
| 2016-11-14 | -0.011 | -0.834 | 0.813 |
| 2016-11-21 | 0.127 | -0.696 | 0.95 |
| 2016-11-28 | 0.299 | -0.49 | 1.087 |
| 2016-12-05 | 0.672 | -0.108 | 1.453 |
| 2016-12-12 | 0.593 | -0.175 | 1.36 |
| 2016-12-19 | 0.483 | -0.27 | 1.235 |
| 2016-12-26 | 0.639 | -0.165 | 1.444 |
| 2017-01-02 | 0.663 | -0.145 | 1.471 |
| 2017-01-09 | 0.652 | -0.314 | 1.617 |
| 2017-01-16 | 0.66 | -0.258 | 1.577 |
| 2017-01-23 | 0.524 | -0.323 | 1.37 |
| 2017-01-30 | 0.701 | -0.113 | 1.515 |
| 2017-02-06 | 0.644 | -0.154 | 1.442 |
| 2017-02-13 | 0.671 | -0.038 | 1.379 |
| 2017-02-20 | 0.808 | 0.055 | 1.562 |
| 2017-02-27 | 0.907 | 0.122 | 1.691 |
| 2017-03-06 | 0.836 | 0.03 | 1.641 |
| 2017-03-13 | 0.831 | -0.018 | 1.68 |
| 2017-03-20 | 0.767 | -0.079 | 1.612 |
| 2017-03-27 | 1.178 | 0.334 | 2.023 |
| 2017-04-03 | 1.21 | 0.435 | 1.986 |
| 2017-04-10 | 0.97 | 0.231 | 1.709 |
| 2017-04-17 | 0.946 | 0.223 | 1.668 |
| 2017-04-24 | 0.739 | 0.003 | 1.476 |
| 2017-05-01 | 1.253 | 0.579 | 1.928 |
| 2017-05-08 | 1.087 | 0.321 | 1.853 |
| 2017-05-15 | 0.924 | 0.141 | 1.708 |
| 2017-05-22 | 1.063 | 0.261 | 1.865 |
| 2017-05-29 | 0.942 | 0.126 | 1.758 |
| 2017-06-05 | 0.903 | 0.097 | 1.709 |
| 2017-06-12 | 0.751 | -0.073 | 1.575 |
| 2017-06-19 | 0.551 | -0.155 | 1.256 |
| 2017-06-26 | 0.452 | -0.267 | 1.171 |
| 2017-07-03 | 0.578 | -0.222 | 1.378 |
| 2017-07-10 | 0.413 | -0.4 | 1.225 |
| 2017-07-17 | 0.54 | -0.203 | 1.283 |
| 2017-07-24 | 0.5 | -0.282 | 1.282 |
| 2017-07-31 | 0.508 | -0.299 | 1.315 |
| 2017-08-07 | 0.463 | -0.395 | 1.32 |
| 2017-08-14 | 0.349 | -0.481 | 1.179 |
| 2017-08-21 | 0.274 | -0.603 | 1.15 |
| 2017-08-28 | 0.258 | -0.639 | 1.155 |
| 2017-09-04 | 0.417 | -0.496 | 1.329 |
| 2017-09-11 | 0.875 | 0.007 | 1.743 |
| 2017-09-18 | 0.946 | 0.121 | 1.77 |
| 2017-09-25 | 0.876 | 0.063 | 1.689 |
| 2017-10-02 | 0.784 | -0.025 | 1.593 |
| 2017-10-09 | 0.926 | 0.116 | 1.735 |
| 2017-10-16 | 0.761 | -0.053 | 1.576 |
| 2017-10-23 | 0.907 | 0.159 | 1.654 |
| 2017-10-30 | 0.833 | 0.073 | 1.594 |
| 2017-11-06 | 0.825 | -0.008 | 1.658 |
| 2017-11-13 | 0.924 | 0.065 | 1.783 |
| 2017-11-20 | 0.803 | -0.092 | 1.698 |
| 2017-11-27 | 0.78 | -0.124 | 1.684 |
| 2017-12-04 | 0.764 | -0.016 | 1.544 |
| 2017-12-11 | 0.963 | 0.125 | 1.801 |
| 2017-12-18 | 0.993 | 0.137 | 1.85 |
| 2017-12-25 | 0.891 | 0.02 | 1.762 |
| 2018-01-01 | 0.856 | 0.001 | 1.712 |
| 2018-01-08 | 0.666 | -0.31 | 1.641 |
| 2018-01-15 | 0.644 | -0.375 | 1.662 |
| 2018-01-22 | 1.094 | 0.081 | 2.108 |
| 2018-01-29 | 1.267 | 0.252 | 2.282 |
| 2018-02-05 | 1.326 | 0.336 | 2.316 |
| 2018-02-12 | 0.77 | -0.084 | 1.623 |
| 2018-02-19 | 0.88 | -0.003 | 1.763 |
| 2018-02-26 | 0.928 | 0.013 | 1.843 |
| 2018-03-05 | 0.802 | -0.133 | 1.737 |
| 2018-03-12 | 0.67 | -0.302 | 1.642 |
| 2018-03-19 | 0.66 | -0.29 | 1.61 |
| 2018-03-26 | 0.759 | -0.113 | 1.631 |
| 2018-04-02 | 0.784 | -0.092 | 1.661 |
| 2018-04-09 | 0.65 | -0.206 | 1.506 |
| 2018-04-16 | 0.585 | -0.292 | 1.463 |
| 2018-04-23 | 0.544 | -0.354 | 1.442 |
| 2018-04-30 | 0.813 | -0.075 | 1.7 |
| 2018-05-07 | 0.501 | -0.444 | 1.446 |
| 2018-05-14 | 0.533 | -0.378 | 1.445 |
| 2018-05-21 | 0.516 | -0.369 | 1.402 |
| 2018-05-28 | 0.715 | -0.183 | 1.613 |
| 2018-06-04 | 0.706 | -0.171 | 1.583 |
| 2018-06-11 | 0.661 | -0.221 | 1.544 |
| 2018-06-18 | 0.613 | -0.27 | 1.497 |
| 2018-06-25 | 0.398 | -0.517 | 1.312 |
| 2018-07-02 | 0.299 | -0.595 | 1.193 |
| 2018-07-09 | 0.274 | -0.628 | 1.175 |
| 2018-07-16 | 0.177 | -0.701 | 1.056 |
| 2018-07-23 | 0.236 | -0.611 | 1.084 |
| 2018-07-30 | 0.314 | -0.555 | 1.182 |
| 2018-08-06 | 0.174 | -0.713 | 1.062 |
| 2018-08-13 | -0.015 | -0.871 | 0.841 |
| 2018-08-20 | -0.299 | -1.169 | 0.571 |
| 2018-08-27 | -0.361 | -1.21 | 0.488 |
| 2018-09-03 | -0.151 | -1.052 | 0.749 |
| 2018-09-10 | -0.23 | -1.15 | 0.69 |
| 2018-09-17 | -0.091 | -0.963 | 0.781 |
| 2018-09-24 | 0.003 | -0.886 | 0.891 |
| 2018-10-01 | 0.177 | -0.689 | 1.043 |
| 2018-10-08 | 0.074 | -0.75 | 0.897 |
| 2018-10-15 | 0.015 | -0.856 | 0.886 |
| 2018-10-22 | -0.13 | -1.045 | 0.784 |
| 2018-10-29 | 0.143 | -0.702 | 0.989 |
| 2018-11-05 | 0.045 | -0.84 | 0.929 |
| 2018-11-12 | 0.128 | -0.812 | 1.068 |
| 2018-11-19 | 0.019 | -0.906 | 0.944 |
| 2018-11-26 | 0.096 | -0.834 | 1.027 |
| 2018-12-03 | 0.495 | -0.355 | 1.345 |
| 2018-12-10 | 0.445 | -0.393 | 1.283 |
| 2018-12-17 | 0.237 | -0.659 | 1.133 |
| 2018-12-24 | 0.104 | -0.826 | 1.034 |
| 2018-12-31 | 0.04 | -0.877 | 0.957 |
| 2019-01-07 | -0.185 | -1.216 | 0.846 |
| 2019-01-14 | -0.446 | -1.493 | 0.6 |
| 2019-01-21 | -0.292 | -1.286 | 0.702 |
| 2019-01-28 | -0.126 | -1.107 | 0.854 |
| 2019-02-04 | -0.239 | -1.211 | 0.733 |
| 2019-02-11 | 0.044 | -0.921 | 1.01 |
| 2019-02-18 | 0.236 | -0.682 | 1.155 |
| 2019-02-25 | 0.13 | -0.798 | 1.058 |
| 2019-03-04 | 0.211 | -0.744 | 1.167 |
| 2019-03-11 | 0.356 | -0.556 | 1.268 |
| 2019-03-18 | 0.342 | -0.598 | 1.281 |
| 2019-03-25 | 0.472 | -0.468 | 1.411 |
| 2019-04-01 | 0.599 | -0.305 | 1.502 |
| 2019-04-08 | 0.492 | -0.434 | 1.417 |
| 2019-04-15 | 0.662 | -0.265 | 1.589 |
| 2019-04-22 | 0.508 | -0.415 | 1.431 |
| 2019-04-29 | 0.531 | -0.415 | 1.476 |
| 2019-05-06 | 0.473 | -0.491 | 1.437 |
| 2019-05-13 | 0.336 | -0.641 | 1.313 |
| 2019-05-20 | 0.449 | -0.514 | 1.413 |
| 2019-05-27 | 0.426 | -0.515 | 1.367 |
| 2019-06-03 | 0.483 | -0.455 | 1.42 |
| 2019-06-10 | 0.276 | -0.653 | 1.205 |
| 2019-06-17 | 0.184 | -0.784 | 1.152 |
| 2019-06-24 | 0.056 | -0.899 | 1.011 |
| 2019-07-01 | 0.279 | -0.673 | 1.23 |
| 2019-07-08 | 0.022 | -0.936 | 0.981 |
| 2019-07-15 | 0.053 | -0.868 | 0.975 |
| 2019-07-22 | -0.004 | -0.936 | 0.927 |
| 2019-07-29 | 0.303 | -0.598 | 1.203 |
| 2019-08-05 | 0.141 | -0.79 | 1.072 |
| 2019-08-12 | -0.149 | -1.073 | 0.775 |
| 2019-08-19 | -0.347 | -1.299 | 0.606 |
| 2019-08-26 | -0.351 | -1.246 | 0.543 |
| 2019-09-02 | -0.043 | -0.923 | 0.836 |
| 2019-09-09 | 0.268 | -0.631 | 1.168 |
| 2019-09-16 | 0.419 | -0.434 | 1.272 |
| 2019-09-23 | 0.38 | -0.468 | 1.229 |
| 2019-09-30 | 0.675 | -0.188 | 1.538 |
| 2019-10-07 | 0.301 | -0.607 | 1.208 |
| 2019-10-14 | 0.342 | -0.554 | 1.238 |
| 2019-10-21 | 0.204 | -0.657 | 1.065 |
| 2019-10-28 | 0.322 | -0.575 | 1.219 |
| 2019-11-04 | 0.355 | -0.575 | 1.285 |
| 2019-11-11 | 0.567 | -0.377 | 1.511 |
| 2019-11-18 | 0.437 | -0.486 | 1.361 |
| 2019-11-25 | 0.688 | -0.245 | 1.621 |
| 2019-12-02 | 0.475 | -0.465 | 1.414 |
| 2019-12-09 | 0.55 | -0.398 | 1.499 |
| 2019-12-16 | 0.608 | -0.341 | 1.556 |
| 2019-12-23 | 0.412 | -0.515 | 1.339 |
| 2019-12-30 | 0.347 | -0.533 | 1.227 |
| 2020-01-06 | 0.242 | -0.724 | 1.207 |
| 2020-01-13 | 0.034 | -1 | 1.068 |
| 2020-01-20 | 0.251 | -0.725 | 1.227 |
| 2020-01-27 | 0.242 | -0.726 | 1.209 |
| 2020-02-03 | -0.055 | -1.036 | 0.926 |
| 2020-02-10 | -0.198 | -1.151 | 0.754 |
| 2020-02-17 | -0.066 | -0.994 | 0.863 |
| 2020-02-24 | 0.011 | -0.873 | 0.895 |
| 2020-03-02 | -0.1 | -1.013 | 0.814 |
| 2020-03-09 | -0.321 | -1.254 | 0.612 |
| 2020-03-16 | -0.921 | -1.809 | -0.033 |
| 2020-03-23 | -1.529 | -2.414 | -0.645 |
| 2020-03-30 | -1.833 | -2.742 | -0.923 |
| 2020-04-06 | -2.174 | -3.129 | -1.22 |
| 2020-04-13 | -2.346 | -3.344 | -1.349 |
| 2020-04-20 | -2.642 | -3.666 | -1.618 |
| 2020-04-27 | -2.565 | -3.561 | -1.568 |
| 2020-05-04 | -2.868 | -3.9 | -1.837 |
| 2020-05-11 | -3.251 | -4.316 | -2.187 |
| 2020-05-18 | -3.297 | -4.379 | -2.215 |
| 2020-05-25 | -3.095 | -4.174 | -2.016 |
| 2020-06-01 | -2.951 | -4.04 | -1.862 |
| 2020-06-08 | -2.789 | -3.832 | -1.745 |
| 2020-06-15 | -2.766 | -3.847 | -1.684 |
| 2020-06-22 | -2.344 | -3.404 | -1.284 |
| 2020-06-29 | -2.149 | -3.207 | -1.09 |
| 2020-07-06 | -2.223 | -3.272 | -1.174 |
| 2020-07-13 | -2.312 | -3.35 | -1.274 |
| 2020-07-20 | -1.889 | -2.895 | -0.883 |
| 2020-07-27 | -1.425 | -2.415 | -0.435 |
| 2020-08-03 | -1.607 | -2.605 | -0.609 |
| 2020-08-10 | -1.375 | -2.375 | -0.374 |
| 2020-08-17 | -1.632 | -2.665 | -0.6 |
| 2020-08-24 | -1.499 | -2.528 | -0.469 |
| 2020-08-31 | -1.18 | -2.2 | -0.16 |
| 2020-09-07 | -1.05 | -2.044 | -0.057 |
| 2020-09-14 | -1.132 | -2.137 | -0.126 |
| 2020-09-21 | -0.818 | -1.824 | 0.187 |
| 2020-09-28 | -0.447 | -1.381 | 0.487 |
| 2020-10-05 | -0.662 | -1.633 | 0.309 |
| 2020-10-12 | -0.639 | -1.617 | 0.339 |
| 2020-10-19 | -0.569 | -1.518 | 0.38 |
| 2020-10-26 | -0.6 | -1.567 | 0.368 |
| 2020-11-02 | -0.465 | -1.44 | 0.509 |
| 2020-11-09 | -0.357 | -1.318 | 0.603 |
| 2020-11-16 | -0.207 | -1.17 | 0.757 |
| 2020-11-23 | -0.059 | -1.026 | 0.908 |
| 2020-11-30 | 0.136 | -0.839 | 1.111 |
| 2020-12-07 | 0.327 | -0.616 | 1.27 |
| 2020-12-14 | 0.593 | -0.361 | 1.546 |
| 2020-12-21 | 0.629 | -0.333 | 1.591 |
| 2020-12-28 | 0.573 | -0.385 | 1.53 |
| 2021-01-04 | 0.224 | -0.764 | 1.213 |
| 2021-01-11 | 0.155 | -0.911 | 1.221 |
| 2021-01-18 | 0.569 | -0.449 | 1.586 |
| 2021-01-25 | 0.675 | -0.342 | 1.692 |
| 2021-02-01 | 0.666 | -0.36 | 1.693 |
| 2021-02-08 | 0.898 | -0.031 | 1.828 |
| 2021-02-15 | 0.896 | -0.067 | 1.859 |
| 2021-02-22 | 1.095 | 0.132 | 2.057 |
| 2021-03-01 | 1.219 | 0.222 | 2.215 |
| 2021-03-08 | 0.994 | 0.014 | 1.974 |
| 2021-03-15 | 0.964 | -0.026 | 1.953 |
| 2021-03-22 | 1.119 | 0.149 | 2.09 |
| 2021-03-29 | 1.074 | 0.1 | 2.048 |
| 2021-04-05 | 1.009 | 0.029 | 1.989 |
| 2021-04-12 | 0.733 | -0.28 | 1.746 |
| 2021-04-19 | 0.803 | -0.165 | 1.771 |
| 2021-04-26 | 1.151 | 0.194 | 2.109 |
| 2021-05-03 | 1.238 | 0.299 | 2.178 |
| 2021-05-10 | 1.074 | 0.092 | 2.055 |
| 2021-05-17 | 0.869 | -0.112 | 1.85 |
| 2021-05-24 | 0.801 | -0.143 | 1.746 |
| 2021-05-31 | 0.935 | 0.033 | 1.837 |
| 2021-06-07 | 1.321 | 0.441 | 2.202 |
| 2021-06-14 | 1.373 | 0.518 | 2.228 |
| 2021-06-21 | 1.233 | 0.367 | 2.098 |
| 2021-06-28 | 1.318 | 0.51 | 2.127 |
| 2021-07-05 | 1.384 | 0.545 | 2.224 |
| 2021-07-12 | 1.449 | 0.596 | 2.301 |
| 2021-07-19 | 1.259 | 0.387 | 2.13 |
| 2021-07-26 | 1.202 | 0.346 | 2.058 |
| 2021-08-02 | 1.058 | 0.162 | 1.953 |
| 2021-08-09 | 0.901 | -0.022 | 1.824 |
| 2021-08-16 | 0.75 | -0.118 | 1.618 |
| 2021-08-23 | 0.668 | -0.231 | 1.568 |
| 2021-08-30 | 0.912 | 0.007 | 1.817 |
| 2021-09-06 | 0.897 | -0.029 | 1.822 |
| 2021-09-13 | 0.808 | -0.063 | 1.678 |
| 2021-09-20 | 0.658 | -0.249 | 1.564 |
| 2021-09-27 | 1.01 | 0.109 | 1.911 |
| 2021-10-04 | 0.776 | -0.154 | 1.705 |
| 2021-10-11 | 0.584 | -0.357 | 1.525 |
| 2021-10-18 | 0.278 | -0.692 | 1.249 |
| 2021-10-25 | 0.117 | -0.873 | 1.108 |
| 2021-11-01 | 0.061 | -0.933 | 1.055 |
| 2021-11-08 | -0.048 | -1.043 | 0.947 |
| 2021-11-15 | -0.007 | -0.98 | 0.967 |
| 2021-11-22 | 0.12 | -0.806 | 1.045 |
| 2021-11-29 | 0.028 | -0.912 | 0.969 |
| 2021-12-06 | -0.117 | -1.057 | 0.822 |
| 2021-12-13 | 0.013 | -0.953 | 0.979 |
| 2021-12-20 | 0.116 | -0.872 | 1.104 |
| 2021-12-27 | 0.475 | -0.46 | 1.409 |
| 2022-01-03 | 0.305 | -0.683 | 1.293 |
| 2022-01-10 | 0.017 | -1.038 | 1.072 |
| 2022-01-17 | -0.26 | -1.268 | 0.748 |
| 2022-01-24 | -0.362 | -1.35 | 0.627 |
| 2022-01-31 | -0.154 | -1.14 | 0.833 |
| 2022-02-07 | -0.31 | -1.295 | 0.676 |
| 2022-02-14 | -0.215 | -1.17 | 0.741 |
| 2022-02-21 | -0.13 | -1.067 | 0.807 |
| 2022-02-28 | -0.169 | -1.136 | 0.798 |
| 2022-03-07 | -0.212 | -1.031 | 0.608 |
| 2022-03-14 | -0.251 | -0.999 | 0.498 |
| 2022-03-21 | -0.368 | -1.216 | 0.481 |
| 2022-03-28 | -0.204 | -1.098 | 0.69 |
| 2022-04-04 | -0.318 | -1.183 | 0.547 |
| 2022-04-11 | -0.151 | -1.085 | 0.782 |
| 2022-04-18 | -0.25 | -1.216 | 0.717 |
| 2022-04-25 | -0.481 | -1.451 | 0.488 |
| 2022-05-02 | -0.442 | -1.358 | 0.474 |
| 2022-05-09 | -0.477 | -1.48 | 0.525 |
| 2022-05-16 | -0.725 | -1.669 | 0.219 |
| 2022-05-23 | -1.007 | -1.98 | -0.034 |
| 2022-05-30 | -0.68 | -1.637 | 0.278 |
| 2022-06-06 | -0.773 | -1.737 | 0.191 |
| 2022-06-13 | -0.797 | -1.881 | 0.288 |
| 2022-06-20 | -0.673 | -1.718 | 0.372 |
| 2022-06-27 | -0.902 | -1.855 | 0.051 |
| 2022-07-04 | -0.495 | -1.37 | 0.38 |
| 2022-07-11 | -0.355 | -1.291 | 0.582 |
| 2022-07-18 | -0.328 | -1.325 | 0.669 |
| 2022-07-25 | -0.167 | -1.205 | 0.87 |
| 2022-08-01 | -0.331 | -1.389 | 0.728 |
| 2022-08-08 | -0.453 | -1.406 | 0.5 |
| 2022-08-15 | -0.478 | -1.485 | 0.528 |
| 2022-08-22 | -0.359 | -1.431 | 0.712 |
| 2022-08-29 | -0.505 | -1.568 | 0.558 |
| 2022-09-05 | 0.085 | -0.798 | 0.969 |
| 2022-09-12 | 0.24 | -0.692 | 1.172 |
| 2022-09-19 | 0.028 | -0.92 | 0.976 |
| 2022-09-26 | -0.313 | -1.259 | 0.633 |
| 2022-10-03 | -0.493 | -1.459 | 0.472 |
| 2022-10-10 | -0.34 | -1.356 | 0.675 |
| 2022-10-17 | -0.696 | -1.737 | 0.345 |
| 2022-10-24 | -0.699 | -1.599 | 0.201 |
| 2022-10-31 | -0.675 | -1.591 | 0.241 |
| 2022-11-07 | -0.88 | -1.855 | 0.096 |
| 2022-11-14 | -0.776 | -1.866 | 0.313 |
| 2022-11-21 | -0.757 | -1.786 | 0.271 |
| 2022-11-28 | -0.423 | -1.38 | 0.534 |
| 2022-12-05 | -0.797 | -1.772 | 0.179 |
| 2022-12-12 | -0.872 | -1.839 | 0.095 |
| 2022-12-19 | -0.809 | -1.774 | 0.155 |
| 2022-12-26 | -0.478 | -1.465 | 0.51 |
| 2023-01-02 | -0.403 | -1.299 | 0.493 |
| 2023-01-09 | -0.624 | -1.622 | 0.373 |
| 2023-01-16 | -0.314 | -1.339 | 0.712 |
| 2023-01-23 | -0.36 | -1.38 | 0.661 |
| 2023-01-30 | -0.331 | -1.34 | 0.678 |
| 2023-02-06 | -0.212 | -1.195 | 0.77 |
| 2023-02-13 | -0.126 | -1.161 | 0.908 |
| 2023-02-20 | 0.009 | -0.914 | 0.932 |
| 2023-02-27 | -0.01 | -1.005 | 0.984 |
| 2023-03-06 | 0.158 | -0.798 | 1.114 |
| 2023-03-13 | 0.228 | -0.75 | 1.207 |
| 2023-03-20 | 0.023 | -0.954 | 1 |
| 2023-03-27 | 0.012 | -0.944 | 0.968 |
| 2023-04-03 | 0.083 | -0.86 | 1.025 |
| 2023-04-10 | 0.127 | -0.935 | 1.19 |
| 2023-04-17 | 0.2 | -0.806 | 1.206 |
| 2023-04-24 | 0.112 | -0.899 | 1.123 |
| 2023-05-01 | 0.432 | -0.574 | 1.437 |
| 2023-05-08 | 0.354 | -0.61 | 1.318 |
| 2023-05-15 | 0.286 | -0.686 | 1.259 |
| 2023-05-22 | 0.26 | -0.715 | 1.235 |
| 2023-05-29 | 0.257 | -0.771 | 1.285 |
| 2023-06-05 | 0.764 | -0.136 | 1.663 |
| 2023-06-12 | 0.733 | -0.213 | 1.68 |
| 2023-06-19 | 0.474 | -0.529 | 1.478 |
| 2023-06-26 | 0.555 | -0.467 | 1.578 |
| 2023-07-03 | 0.748 | -0.127 | 1.622 |
| 2023-07-10 | 0.765 | -0.238 | 1.768 |
| 2023-07-17 | 0.654 | -0.319 | 1.626 |
| 2023-07-24 | 0.596 | -0.34 | 1.532 |
| 2023-07-31 | 0.584 | -0.399 | 1.567 |
| 2023-08-07 | 0.428 | -0.471 | 1.327 |
| 2023-08-14 | 0.323 | -0.574 | 1.219 |
| 2023-08-21 | 0.149 | -0.78 | 1.079 |
| 2023-08-28 | 0.361 | -0.546 | 1.268 |
| 2023-09-04 | 0.334 | -0.575 | 1.244 |
| 2023-09-11 | 0.404 | -0.624 | 1.433 |
| 2023-09-18 | 0.257 | -0.726 | 1.24 |
| 2023-09-25 | 0.518 | -0.46 | 1.496 |
| 2023-10-02 | 0.599 | -0.336 | 1.534 |
| 2023-10-09 | 0.602 | -0.37 | 1.575 |
| 2023-10-16 | 0.721 | -0.179 | 1.621 |
| 2023-10-23 | 0.535 | -0.364 | 1.433 |
| 2023-10-30 | 0.797 | -0.085 | 1.679 |
| 2023-11-06 | 0.591 | -0.318 | 1.5 |
| 2023-11-13 | 0.494 | -0.508 | 1.495 |
| 2023-11-20 | 0.584 | -0.348 | 1.516 |
| 2023-11-27 | 0.575 | -0.491 | 1.64 |
| 2023-12-04 | 0.675 | -0.215 | 1.564 |
| 2023-12-11 | 0.658 | -0.284 | 1.601 |
| 2023-12-18 | 0.691 | -0.265 | 1.646 |
| 2023-12-25 | 0.97 | 0.156 | 1.783 |
| 2024-01-01 | 0.996 | 0.141 | 1.851 |
| 2024-01-08 | 0.72 | -0.231 | 1.671 |
| 2024-01-15 | 0.76 | -0.292 | 1.811 |
| 2024-01-22 | 0.556 | -0.42 | 1.531 |
| 2024-01-29 | 0.861 | -0.072 | 1.794 |
| 2024-02-05 | 0.947 | 0.032 | 1.862 |
| 2024-02-12 | 0.762 | -0.146 | 1.67 |
| 2024-02-19 | 0.828 | -0.193 | 1.85 |
| 2024-02-26 | 1.077 | 0.089 | 2.066 |
| 2024-03-04 | 0.962 | 0.046 | 1.877 |
| 2024-03-11 | 0.903 | -0.134 | 1.94 |
| 2024-03-18 | 1.027 | 0.077 | 1.976 |
| 2024-03-25 | 1.335 | 0.478 | 2.191 |
| 2024-04-01 | 1.181 | 0.248 | 2.114 |
| 2024-04-08 | 1.367 | 0.492 | 2.243 |
| 2024-04-15 | 1.292 | 0.288 | 2.296 |
| 2024-04-22 | 1.132 | 0.19 | 2.073 |
| 2024-04-29 | 1.091 | 0.115 | 2.067 |